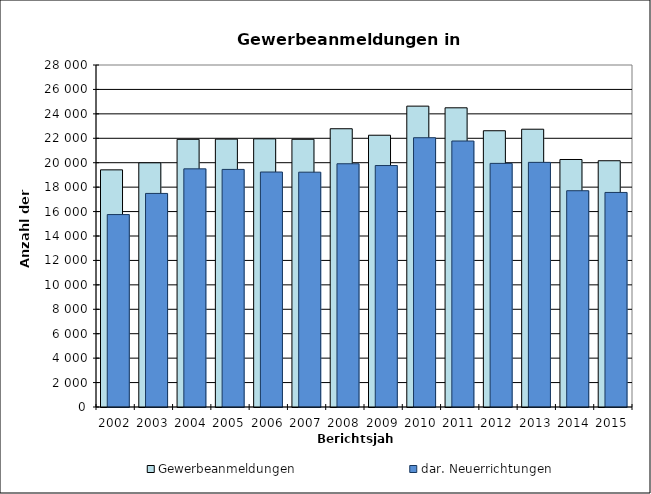
| Category | Gewerbeanmeldungen | dar. Neuerrichtungen |
|---|---|---|
| 2002.0 | 19416 | 15755 |
| 2003.0 | 19992 | 17485 |
| 2004.0 | 21914 | 19499 |
| 2005.0 | 21931 | 19452 |
| 2006.0 | 21955 | 19238 |
| 2007.0 | 21918 | 19225 |
| 2008.0 | 22781 | 19914 |
| 2009.0 | 22250 | 19769 |
| 2010.0 | 24632 | 22046 |
| 2011.0 | 24495 | 21777 |
| 2012.0 | 22618 | 19945 |
| 2013.0 | 22743 | 20029 |
| 2014.0 | 20264 | 17706 |
| 2015.0 | 20162 | 17566 |